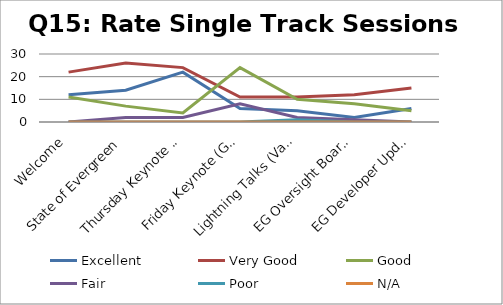
| Category | Excellent | Very Good | Good | Fair | Poor | N/A |
|---|---|---|---|---|---|---|
| Welcome | 12 | 22 | 11 | 0 | 0 | 0 |
| State of Evergreen  | 14 | 26 | 7 | 2 | 0 | 0 |
| Thursday Keynote (Jono Bacon) | 22 | 24 | 4 | 2 | 0 | 0 |
| Friday Keynote (Galadriel Chilton) | 6 | 11 | 24 | 8 | 0 | 0 |
| Lightning Talks (Various) | 5 | 11 | 10 | 2 | 1 | 0 |
| EG Oversight Board Update | 2 | 12 | 8 | 1 | 0 | 0 |
| EG Developer Update | 6 | 15 | 5 | 0 | 0 | 0 |